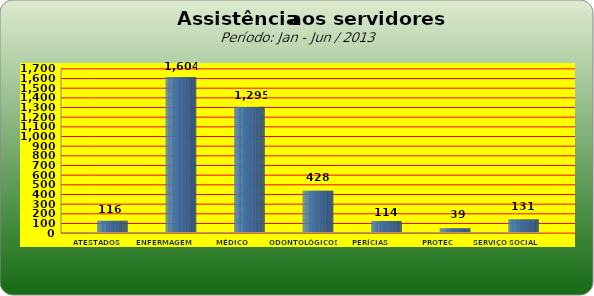
| Category | Series 0 |
|---|---|
| ATESTADOS MÉDICOS | 116 |
| ENFERMAGEM | 1604 |
| MÉDICO | 1295 |
| ODONTOLÓGICOS | 428 |
| PERÍCIAS MÉDICAS | 114 |
| PROTEC | 39 |
| SERVIÇO SOCIAL | 131 |